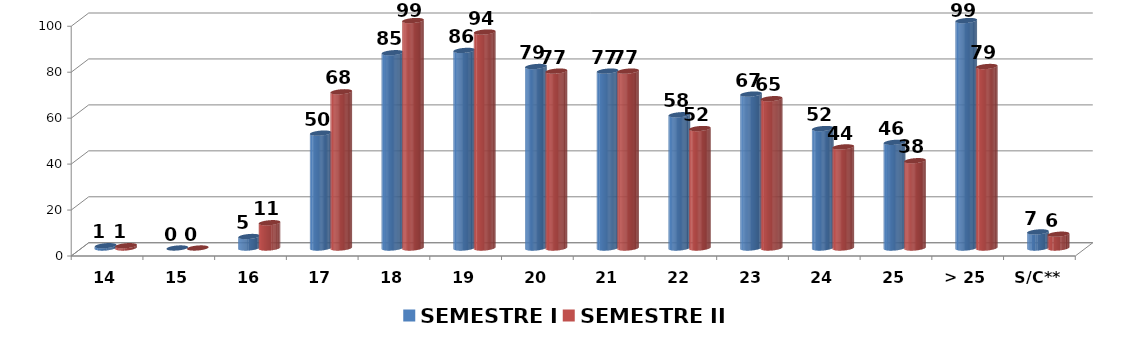
| Category | SEMESTRE I | SEMESTRE II |
|---|---|---|
| 14 | 1 | 1 |
| 15 | 0 | 0 |
| 16 | 5 | 11 |
| 17 | 50 | 68 |
| 18 | 85 | 99 |
| 19 | 86 | 94 |
| 20 | 79 | 77 |
| 21 | 77 | 77 |
| 22 | 58 | 52 |
| 23 | 67 | 65 |
| 24 | 52 | 44 |
| 25 | 46 | 38 |
| > 25 | 99 | 79 |
| S/C** | 7 | 6 |